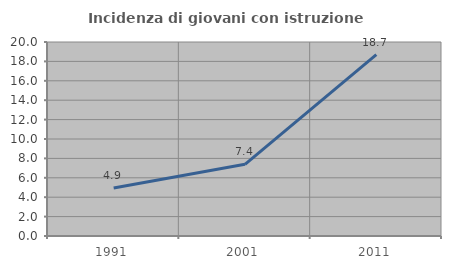
| Category | Incidenza di giovani con istruzione universitaria |
|---|---|
| 1991.0 | 4.938 |
| 2001.0 | 7.389 |
| 2011.0 | 18.697 |